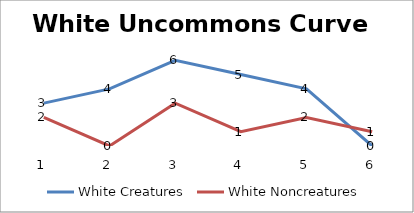
| Category | White Creatures | White Noncreatures |
|---|---|---|
| 0 | 3 | 2 |
| 1 | 4 | 0 |
| 2 | 6 | 3 |
| 3 | 5 | 1 |
| 4 | 4 | 2 |
| 5 | 0 | 1 |